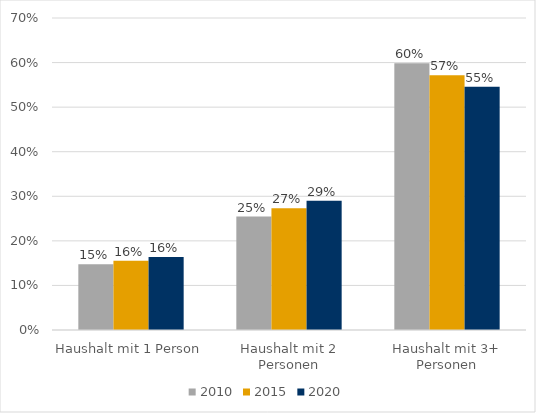
| Category | 2010 | 2015 | 2020 |
|---|---|---|---|
| Haushalt mit 1 Person | 0.147 | 0.155 | 0.164 |
| Haushalt mit 2 Personen | 0.254 | 0.273 | 0.29 |
| Haushalt mit 3+ Personen | 0.598 | 0.571 | 0.546 |